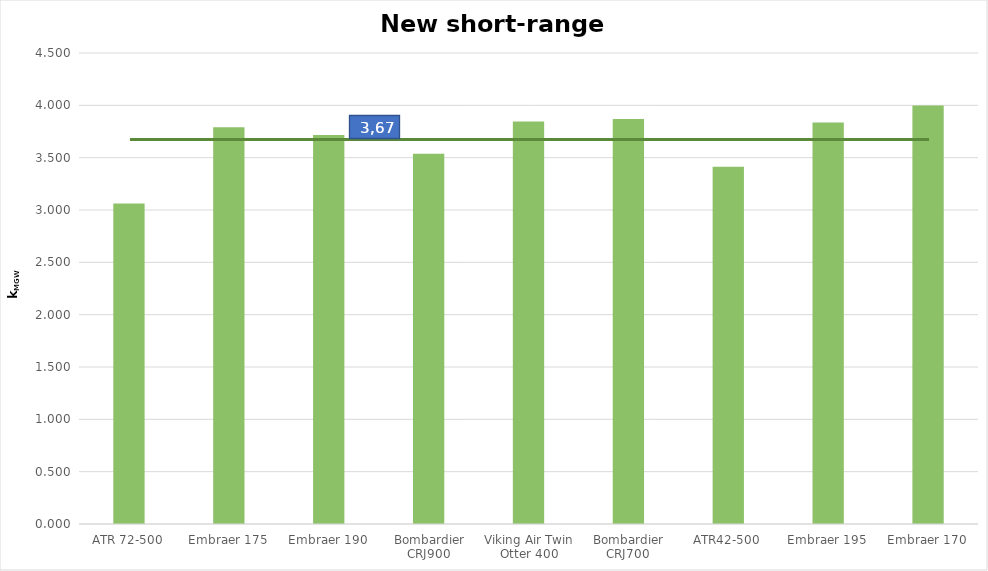
| Category | Anzahl | in Order | Gesamt Flugzeugtyp | Prozent von Gesamt (inklusive Order) | Summe der meisten Flugzeugtypen in Prozent | Gesamt (inklusive order) | Series 6 | mMTO [kg] | Series 8 | mOE [kg] | Series 10 | mMPL [kg] | Series 12 | mOE/mMTO | Series 14 | mPL/mMTO | Series 16 | kMGW | Quellen | Body | Erstflug | Streckenart |
|---|---|---|---|---|---|---|---|---|---|---|---|---|---|---|---|---|---|---|---|---|---|---|
| ATR 72-500 |  |  |  |  |  |  |  |  |  |  |  |  |  |  |  |  |  | 3.061 |  |  |  |  |
| Embraer 175 |  |  |  |  |  |  |  |  |  |  |  |  |  |  |  |  |  | 3.792 |  |  |  |  |
| Embraer 190 |  |  |  |  |  |  |  |  |  |  |  |  |  |  |  |  |  | 3.718 |  |  |  |  |
| Bombardier CRJ900 |  |  |  |  |  |  |  |  |  |  |  |  |  |  |  |  |  | 3.537 |  |  |  |  |
| Viking Air Twin Otter 400 |  |  |  |  |  |  |  |  |  |  |  |  |  |  |  |  |  | 3.847 |  |  |  |  |
| Bombardier CRJ700 |  |  |  |  |  |  |  |  |  |  |  |  |  |  |  |  |  | 3.869 |  |  |  |  |
| ATR42-500 |  |  |  |  |  |  |  |  |  |  |  |  |  |  |  |  |  | 3.413 |  |  |  |  |
| Embraer 195 |  |  |  |  |  |  |  |  |  |  |  |  |  |  |  |  |  | 3.836 |  |  |  |  |
| Embraer 170 |  |  |  |  |  |  |  |  |  |  |  |  |  |  |  |  |  | 3.999 |  |  |  |  |